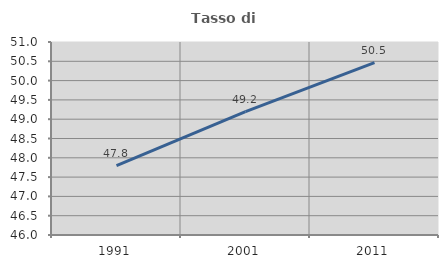
| Category | Tasso di occupazione   |
|---|---|
| 1991.0 | 47.795 |
| 2001.0 | 49.195 |
| 2011.0 | 50.466 |